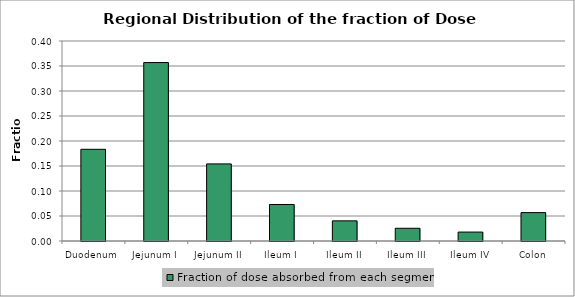
| Category | Fraction of dose absorbed from each segment |
|---|---|
| Duodenum | 0.183 |
| Jejunum I | 0.357 |
| Jejunum II | 0.154 |
| Ileum I | 0.073 |
| Ileum II | 0.04 |
| Ileum III | 0.025 |
| Ileum IV | 0.018 |
| Colon | 0.057 |